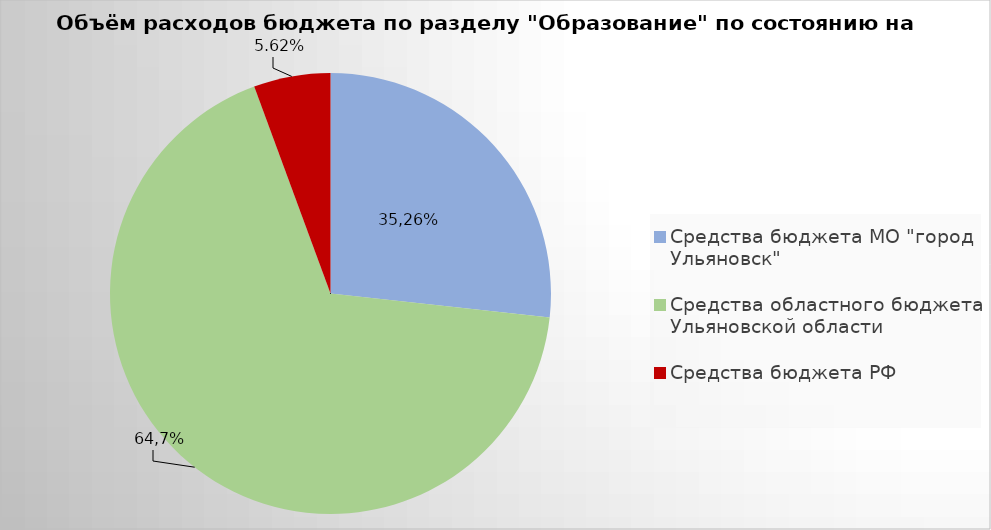
| Category | Series 0 |
|---|---|
| Средства бюджета МО "город Ульяновск" | 2041803 |
| Средства областного бюджета Ульяновской области | 5163847.48 |
| Средства бюджета РФ | 429251.76 |